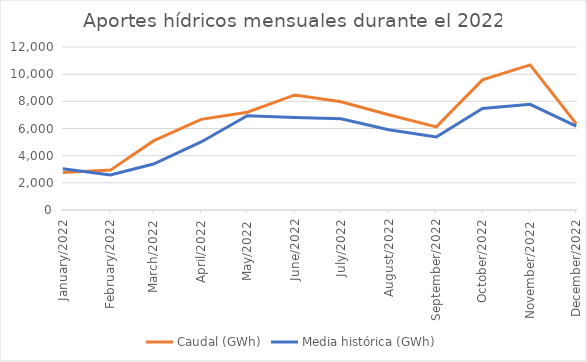
| Category | Caudal (GWh) | Media histórica (GWh) |
|---|---|---|
| 2022-01-01 | 2760.065 | 3042.96 |
| 2022-02-01 | 2936.162 | 2583 |
| 2022-03-01 | 5086.346 | 3386.13 |
| 2022-04-01 | 6670.764 | 5010.9 |
| 2022-05-01 | 7201.54 | 6936.56 |
| 2022-06-01 | 8472.1 | 6811.5 |
| 2022-07-01 | 7968.986 | 6713.67 |
| 2022-08-01 | 7012.548 | 5909.22 |
| 2022-09-01 | 6121.222 | 5378.1 |
| 2022-10-01 | 9575.009 | 7478.13 |
| 2022-11-01 | 10682.234 | 7779.3 |
| 2022-12-01 | 6344.749 | 6177.37 |